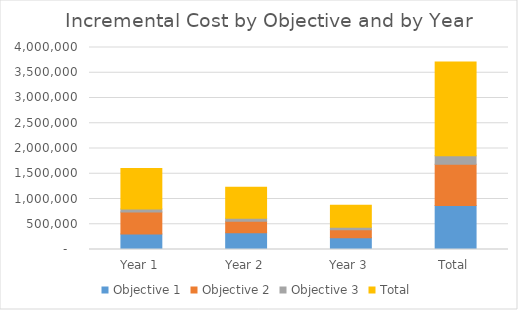
| Category | Objective 1 | Objective 2 | Objective 3 | Total |
|---|---|---|---|---|
| Year 1 | 307625 | 433240 | 60325 | 801190 |
| Year 2 | 331670 | 226640 | 59175 | 617485 |
| Year 3 | 231970 | 156880 | 49475 | 438325 |
| Total | 871265 | 816760 | 168975 | 1857000 |